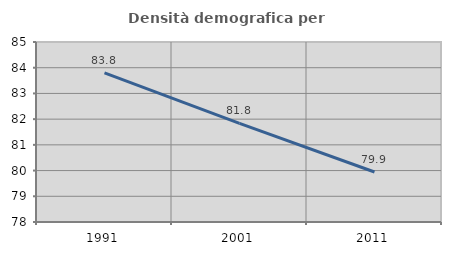
| Category | Densità demografica |
|---|---|
| 1991.0 | 83.798 |
| 2001.0 | 81.836 |
| 2011.0 | 79.945 |